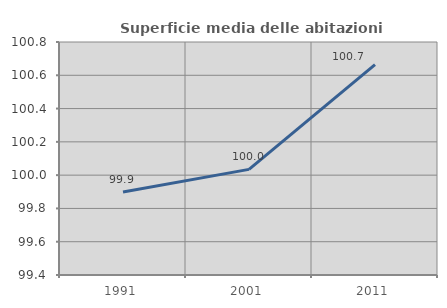
| Category | Superficie media delle abitazioni occupate |
|---|---|
| 1991.0 | 99.899 |
| 2001.0 | 100.035 |
| 2011.0 | 100.665 |